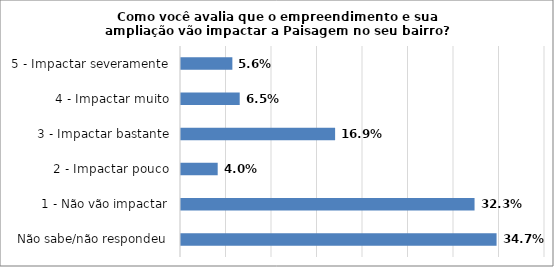
| Category | Series 0 |
|---|---|
| Não sabe/não respondeu | 0.347 |
| 1 - Não vão impactar | 0.323 |
| 2 - Impactar pouco | 0.04 |
| 3 - Impactar bastante | 0.169 |
| 4 - Impactar muito | 0.065 |
| 5 - Impactar severamente | 0.056 |